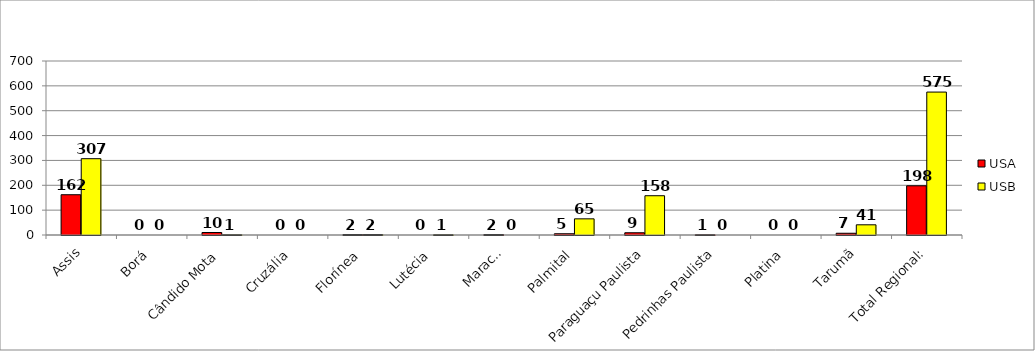
| Category | USA | USB |
|---|---|---|
| Assis | 162 | 307 |
| Borá | 0 | 0 |
| Cândido Mota | 10 | 1 |
| Cruzália | 0 | 0 |
| Florínea | 2 | 2 |
| Lutécia | 0 | 1 |
| Maracaí | 2 | 0 |
| Palmital | 5 | 65 |
| Paraguaçu Paulista | 9 | 158 |
| Pedrinhas Paulista | 1 | 0 |
| Platina | 0 | 0 |
| Tarumã | 7 | 41 |
| Total Regional: | 198 | 575 |